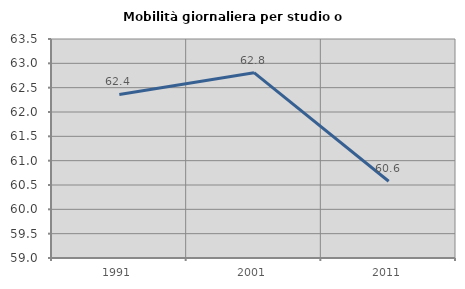
| Category | Mobilità giornaliera per studio o lavoro |
|---|---|
| 1991.0 | 62.361 |
| 2001.0 | 62.808 |
| 2011.0 | 60.578 |